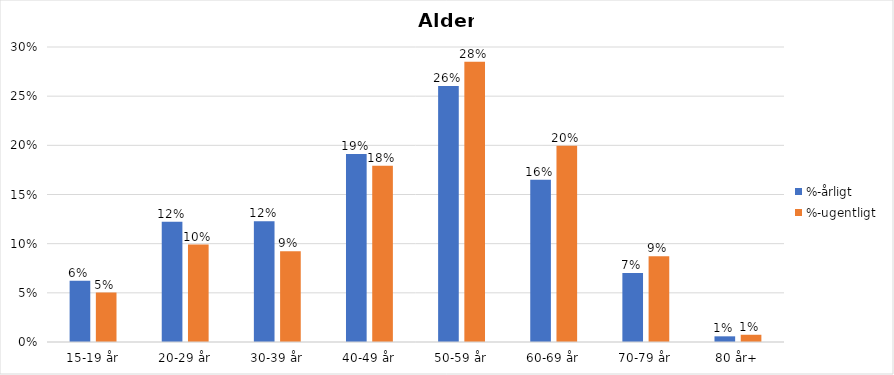
| Category | %-årligt | %-ugentligt |
|---|---|---|
| 15-19 år | 0.062 | 0.05 |
| 20-29 år | 0.122 | 0.099 |
| 30-39 år | 0.123 | 0.092 |
| 40-49 år | 0.191 | 0.179 |
| 50-59 år | 0.26 | 0.285 |
| 60-69 år | 0.165 | 0.199 |
| 70-79 år | 0.07 | 0.087 |
| 80 år+ | 0.006 | 0.007 |